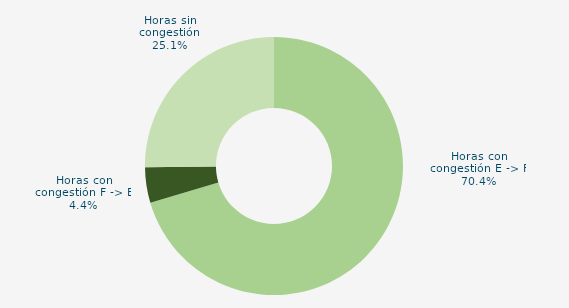
| Category | Horas con congestión E -> F |
|---|---|
| Horas con congestión E -> F | 70.417 |
| Horas con congestión F -> E | 4.444 |
| Horas sin congestión | 25.139 |